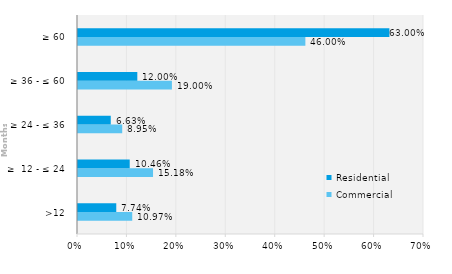
| Category | Commercial | Residential |
|---|---|---|
| >12 | 0.11 | 0.077 |
| ≥  12 - ≤ 24 | 0.152 | 0.105 |
| ≥ 24 - ≤ 36 | 0.089 | 0.066 |
| ≥ 36 - ≤ 60 | 0.19 | 0.12 |
| ≥ 60 | 0.46 | 0.63 |